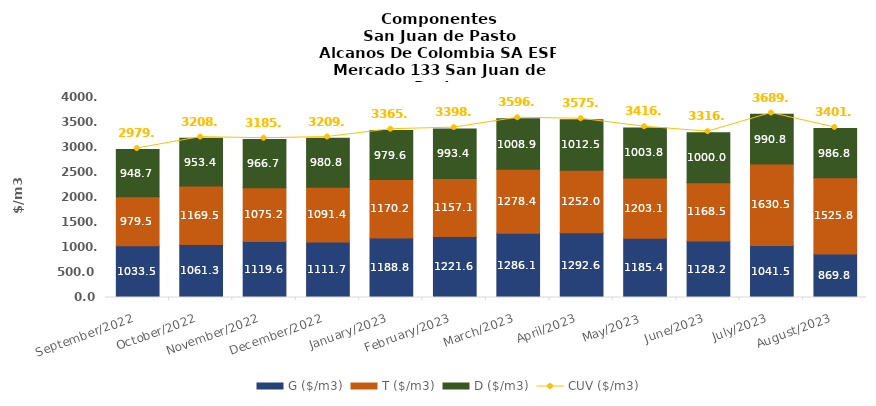
| Category | G ($/m3) | T ($/m3) | D ($/m3) |
|---|---|---|---|
| 2022-09-01 | 1033.47 | 979.51 | 948.67 |
| 2022-10-01 | 1061.27 | 1169.53 | 953.42 |
| 2022-11-01 | 1119.61 | 1075.19 | 966.69 |
| 2022-12-01 | 1111.69 | 1091.36 | 980.8 |
| 2023-01-01 | 1188.81 | 1170.15 | 979.57 |
| 2023-02-01 | 1221.59 | 1157.08 | 993.4 |
| 2023-03-01 | 1286.09 | 1278.38 | 1008.86 |
| 2023-04-01 | 1292.6 | 1251.95 | 1012.48 |
| 2023-05-01 | 1185.42 | 1203.07 | 1003.78 |
| 2023-06-01 | 1128.21 | 1168.47 | 999.96 |
| 2023-07-01 | 1041.54 | 1630.51 | 990.77 |
| 2023-08-01 | 869.82 | 1525.81 | 986.78 |